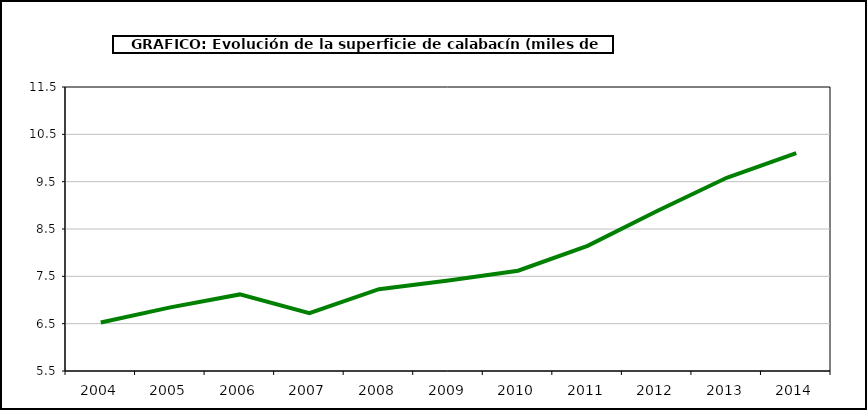
| Category | superficie |
|---|---|
| 2004.0 | 6.523 |
| 2005.0 | 6.845 |
| 2006.0 | 7.118 |
| 2007.0 | 6.724 |
| 2008.0 | 7.229 |
| 2009.0 | 7.41 |
| 2010.0 | 7.618 |
| 2011.0 | 8.144 |
| 2012.0 | 8.879 |
| 2013.0 | 9.582 |
| 2014.0 | 10.102 |